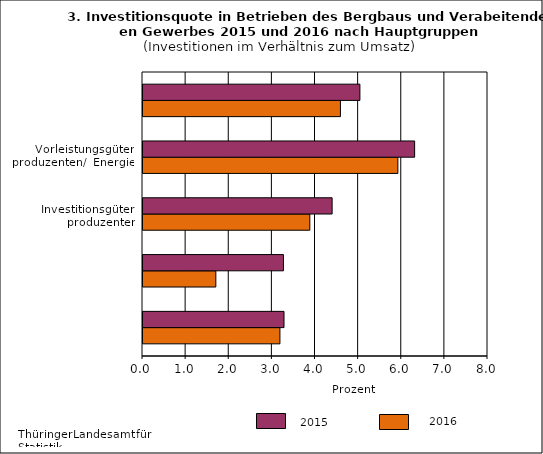
| Category | BJ | VJ |
|---|---|---|
| 0 | 3.175 | 3.27 |
| 1 | 1.689 | 3.257 |
| 2 | 3.868 | 4.385 |
| 3 | 5.91 | 6.299 |
| 4 | 4.578 | 5.029 |